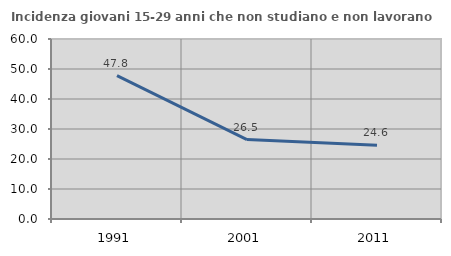
| Category | Incidenza giovani 15-29 anni che non studiano e non lavorano  |
|---|---|
| 1991.0 | 47.81 |
| 2001.0 | 26.486 |
| 2011.0 | 24.599 |